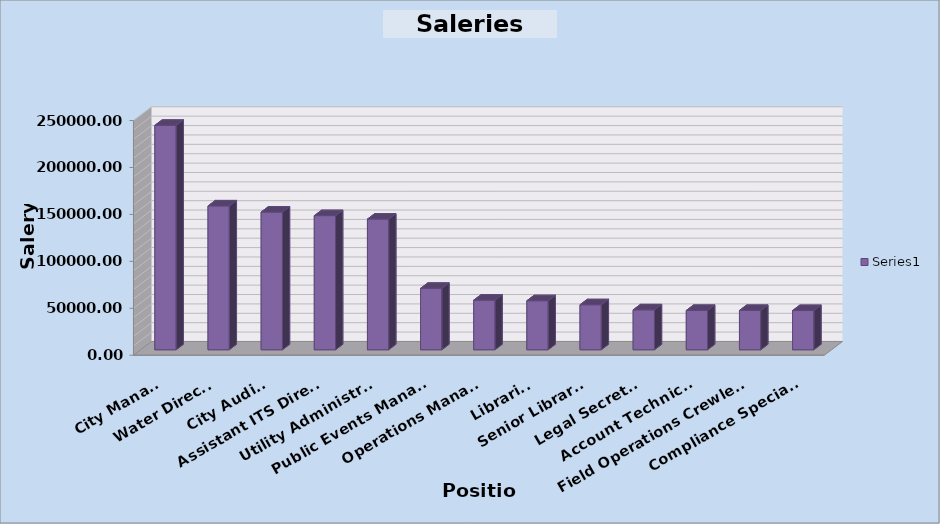
| Category | Series 0 |
|---|---|
| City Manager | 239057.725 |
| Water Director | 153240.88 |
| City Audito | 146695.64 |
| Assistant ITS Director | 142877.595 |
| Utility Administrator | 139190.37 |
| Public Events Manager | 65418.44 |
| Operations Manager | 52862.885 |
| Librarian | 52241.28 |
| Senior Librarian | 47947.64 |
| Legal Secretary | 42505.95 |
| Account Technician | 41901.6 |
| Field Operations Crewleader | 41879.76 |
| Compliance Specialist | 41771.6 |